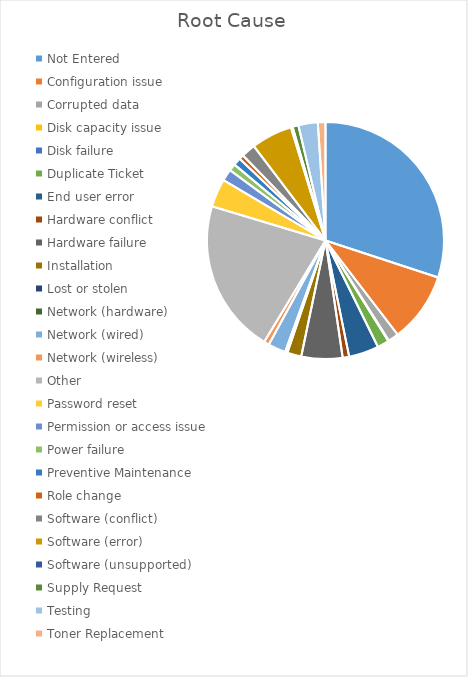
| Category | Series 0 |
|---|---|
| Not Entered | 375 |
| Configuration issue  | 119 |
| Corrupted data  | 18 |
| Disk capacity issue  | 1 |
| Disk failure  | 0 |
| Duplicate Ticket  | 20 |
| End user error  | 51 |
| Hardware conflict  | 11 |
| Hardware failure  | 70 |
| Installation  | 24 |
| Lost or stolen  | 1 |
| Network (hardware)  | 3 |
| Network (wired)  | 30 |
| Network (wireless)  | 9 |
| Other  | 262 |
| Password reset  | 48 |
| Permission or access issue  | 20 |
| Power failure  | 12 |
| Preventive Maintenance  | 13 |
| Role change  | 8 |
| Software (conflict)  | 24 |
| Software (error)  | 70 |
| Software (unsupported)  | 3 |
| Supply Request  | 10 |
| Testing  | 33 |
| Toner Replacement  | 13 |